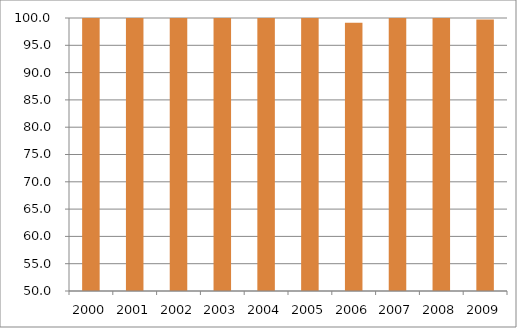
| Category | Região Sul |
|---|---|
| 2000.0 | 106.88 |
| 2001.0 | 107.61 |
| 2002.0 | 104.75 |
| 2003.0 | 104.26 |
| 2004.0 | 103.51 |
| 2005.0 | 103.65 |
| 2006.0 | 99.13 |
| 2007.0 | 101.46 |
| 2008.0 | 100.68 |
| 2009.0 | 99.72 |